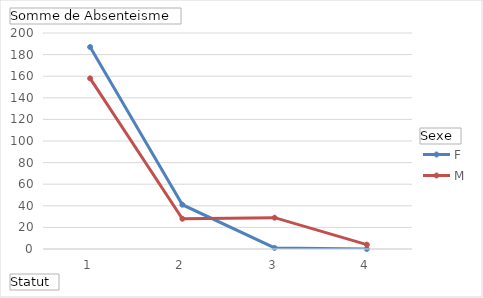
| Category | F | M |
|---|---|---|
| 1 | 187 | 158 |
| 2 | 41 | 28 |
| 3 | 1 | 29 |
| 4 | 0 | 4 |